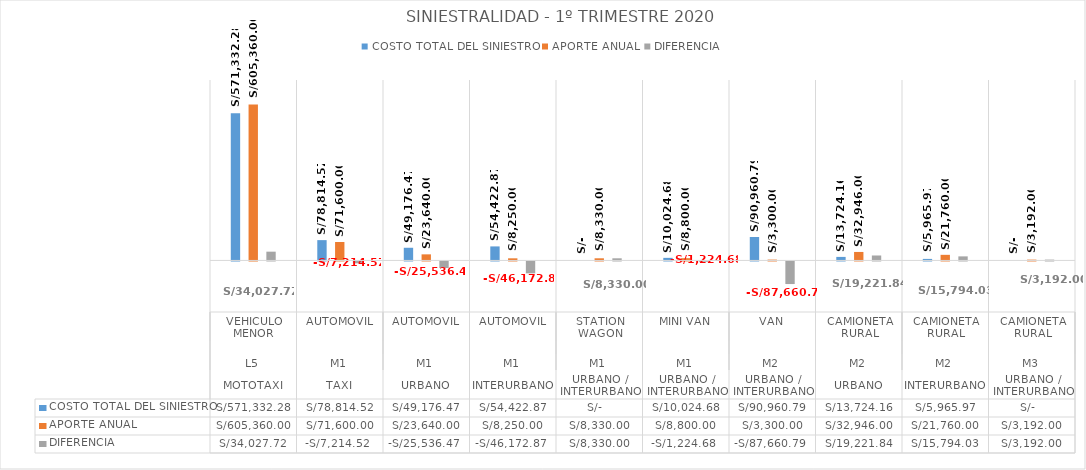
| Category | COSTO TOTAL DEL SINIESTRO | APORTE ANUAL | DIFERENCIA |
|---|---|---|---|
| 0 | 571332.28 | 605360 | 34027.72 |
| 1 | 78814.52 | 71600 | -7214.52 |
| 2 | 49176.47 | 23640 | -25536.47 |
| 3 | 54422.87 | 8250 | -46172.87 |
| 4 | 0 | 8330 | 8330 |
| 5 | 10024.68 | 8800 | -1224.68 |
| 6 | 90960.79 | 3300 | -87660.79 |
| 7 | 13724.16 | 32946 | 19221.84 |
| 8 | 5965.97 | 21760 | 15794.03 |
| 9 | 0 | 3192 | 3192 |